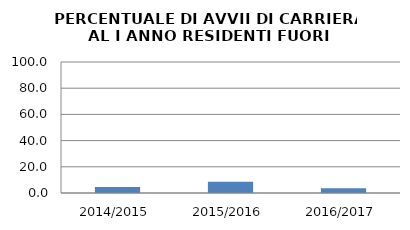
| Category | 2014/2015 2015/2016 2016/2017 |
|---|---|
| 2014/2015 | 4.545 |
| 2015/2016 | 8.649 |
| 2016/2017 | 3.704 |